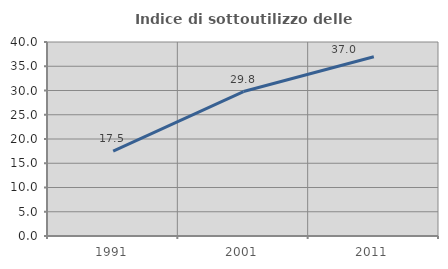
| Category | Indice di sottoutilizzo delle abitazioni  |
|---|---|
| 1991.0 | 17.519 |
| 2001.0 | 29.782 |
| 2011.0 | 36.965 |